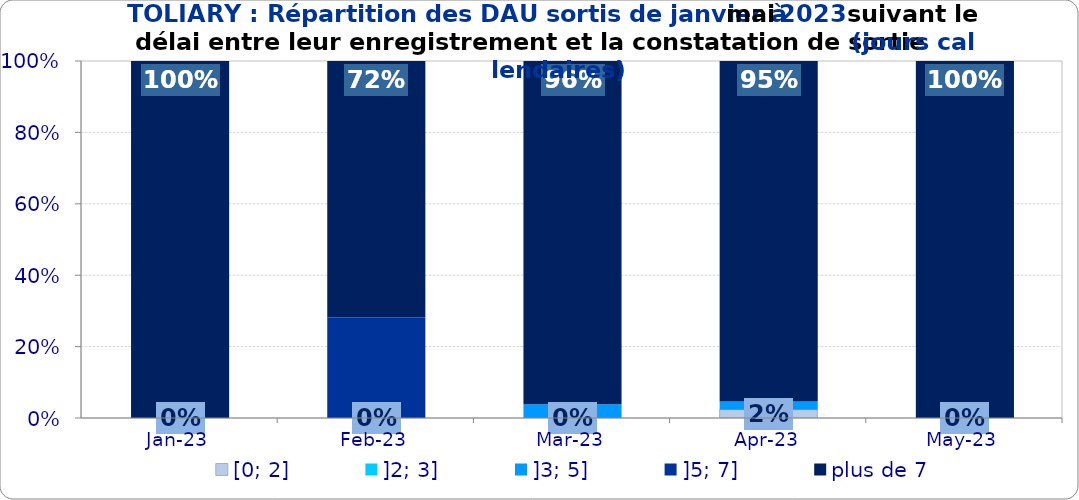
| Category | [0; 2] | ]2; 3] | ]3; 5] | ]5; 7] | plus de 7 |
|---|---|---|---|---|---|
| 2023-01-01 | 0 | 0 | 0 | 0 | 1 |
| 2023-02-01 | 0 | 0 | 0 | 0.281 | 0.719 |
| 2023-03-01 | 0 | 0 | 0.038 | 0 | 0.962 |
| 2023-04-01 | 0.023 | 0 | 0.023 | 0 | 0.953 |
| 2023-05-01 | 0 | 0 | 0 | 0 | 1 |